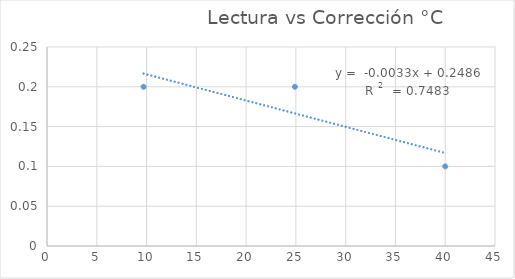
| Category | Corrección °C |
|---|---|
| 9.7 | 0.2 |
| 24.9 | 0.2 |
| 40.0 | 0.1 |